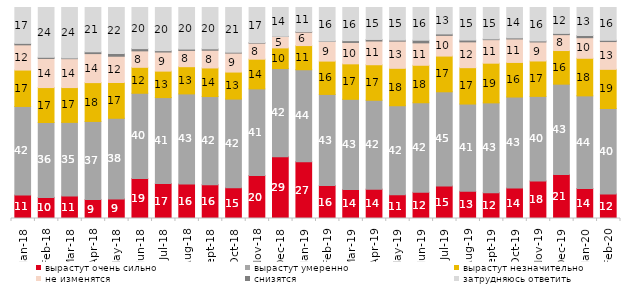
| Category | вырастут очень сильно | вырастут умеренно | вырастут незначительно | не изменятся | снизятся | затрудняюсь ответить |
|---|---|---|---|---|---|---|
| 2018-01-01 | 11.1 | 42 | 17.25 | 11.95 | 0.7 | 17 |
| 2018-02-01 | 10 | 35.5 | 16.55 | 13.8 | 0.55 | 23.6 |
| 2018-03-01 | 10.65 | 34.9 | 16.5 | 13.7 | 0.35 | 23.9 |
| 2018-04-01 | 8.95 | 37.05 | 18.4 | 13.75 | 0.85 | 21 |
| 2018-05-01 | 9.3 | 38.2 | 16.95 | 12.45 | 1.3 | 21.8 |
| 2018-06-01 | 18.95 | 40.4 | 12.3 | 7.8 | 1.05 | 19.5 |
| 2018-07-01 | 16.55 | 40.75 | 12.55 | 9.05 | 0.65 | 20.45 |
| 2018-08-01 | 16.35 | 42.7 | 12.9 | 7.7 | 0.65 | 19.7 |
| 2018-09-01 | 16.05 | 41.75 | 13.55 | 8.4 | 0.65 | 19.6 |
| 2018-10-01 | 14.6 | 42 | 12.8 | 9 | 0.4 | 21.2 |
| 2018-11-01 | 20.359 | 41.068 | 14.072 | 7.585 | 0.25 | 16.667 |
| 2018-12-01 | 29.25 | 41.8 | 9.8 | 5.4 | 0.1 | 13.65 |
| 2019-01-01 | 26.85 | 43.65 | 11.45 | 6.35 | 0.3 | 11.4 |
| 2019-02-01 | 15.6 | 43.2 | 15.8 | 9.35 | 0.15 | 15.9 |
| 2019-03-01 | 13.774 | 42.715 | 16.808 | 10.144 | 0.845 | 15.714 |
| 2019-04-01 | 13.911 | 42.129 | 16.832 | 11.238 | 0.743 | 15.149 |
| 2019-05-01 | 11.293 | 42.15 | 17.732 | 12.878 | 0.495 | 15.453 |
| 2019-06-01 | 12.419 | 42.444 | 17.756 | 10.623 | 1.247 | 15.511 |
| 2019-07-01 | 15.396 | 44.653 | 16.931 | 9.802 | 0.693 | 12.525 |
| 2019-08-01 | 12.887 | 41.359 | 17.233 | 12.238 | 0.849 | 15.435 |
| 2019-09-01 | 12.228 | 42.574 | 18.812 | 11.139 | 0.347 | 14.901 |
| 2019-10-01 | 14.455 | 43.119 | 16.386 | 11.139 | 0.495 | 14.406 |
| 2019-11-01 | 17.772 | 40.099 | 16.782 | 9.01 | 0.495 | 15.842 |
| 2019-12-01 | 20.891 | 42.772 | 15.941 | 7.525 | 0.594 | 12.277 |
| 2020-01-01 | 14.208 | 43.911 | 17.822 | 9.752 | 1.04 | 13.267 |
| 2020-02-01 | 11.634 | 40.495 | 18.564 | 13.168 | 0.594 | 15.545 |